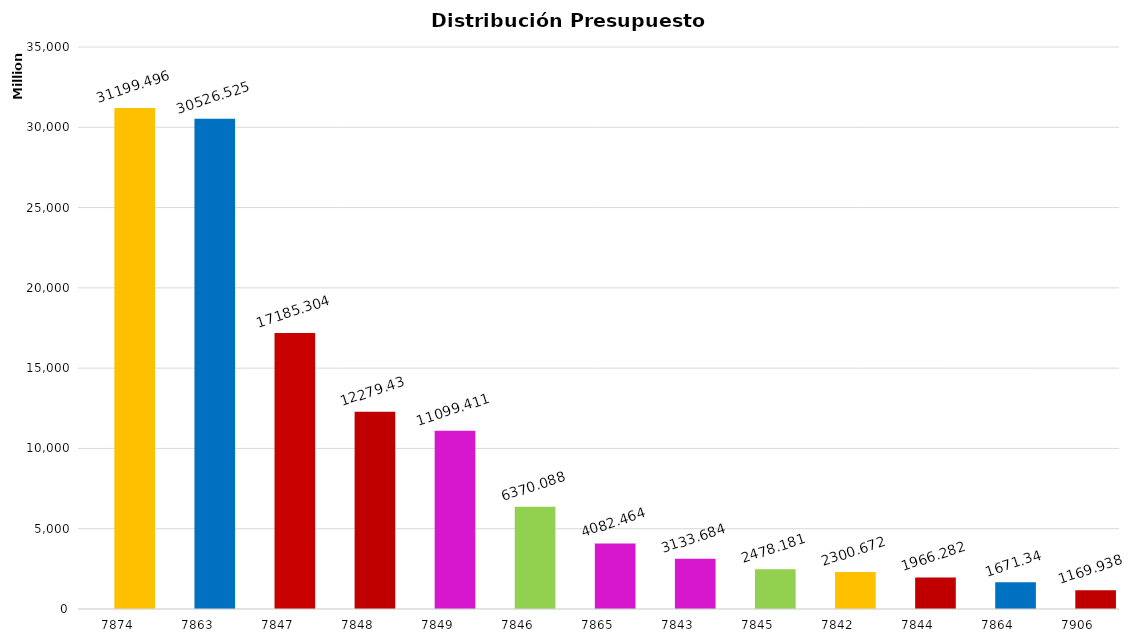
| Category | Series 0 | Series 1 |
|---|---|---|
| 7874.0 | 7874 | 31199496000 |
| 7863.0 | 7863 | 30526525000 |
| 7847.0 | 7847 | 17185304000 |
| 7848.0 | 7848 | 12279430000 |
| 7849.0 | 7849 | 11099411000 |
| 7846.0 | 7846 | 6370088000 |
| 7865.0 | 7865 | 4082464000 |
| 7843.0 | 7843 | 3133684000 |
| 7845.0 | 7845 | 2478181000 |
| 7842.0 | 7842 | 2300672000 |
| 7844.0 | 7844 | 1966282000 |
| 7864.0 | 7864 | 1671340000 |
| 7906.0 | 7906 | 1169938000 |